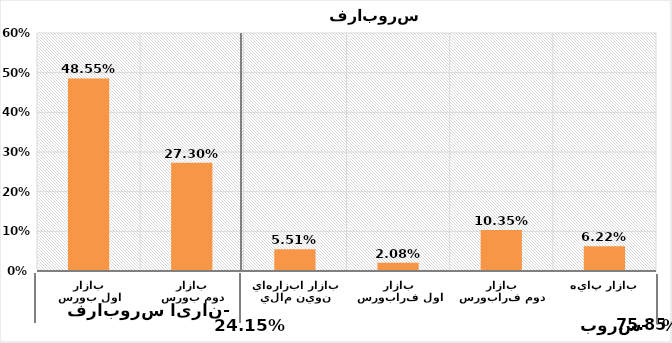
| Category | Series 0 |
|---|---|
| بازار اول بورس | 0.486 |
| بازار دوم بورس | 0.273 |
| بازار ابزارهاي نوين مالي | 0.055 |
| بازار اول فرابورس | 0.021 |
| بازار دوم فرابورس | 0.103 |
| بازار پايه | 0.062 |